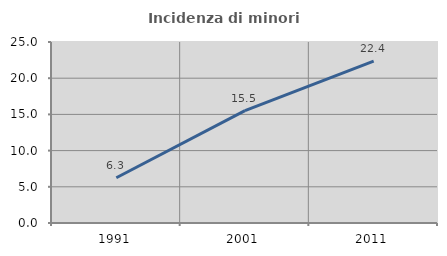
| Category | Incidenza di minori stranieri |
|---|---|
| 1991.0 | 6.25 |
| 2001.0 | 15.517 |
| 2011.0 | 22.368 |